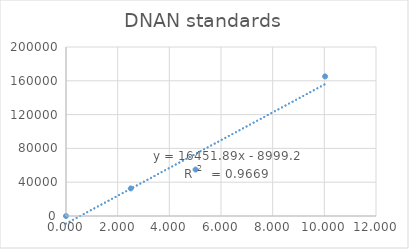
| Category | Series 0 |
|---|---|
| 0.0 | 0 |
| 2.5075 | 32625 |
| 5.015 | 54952 |
| 10.03 | 165198 |